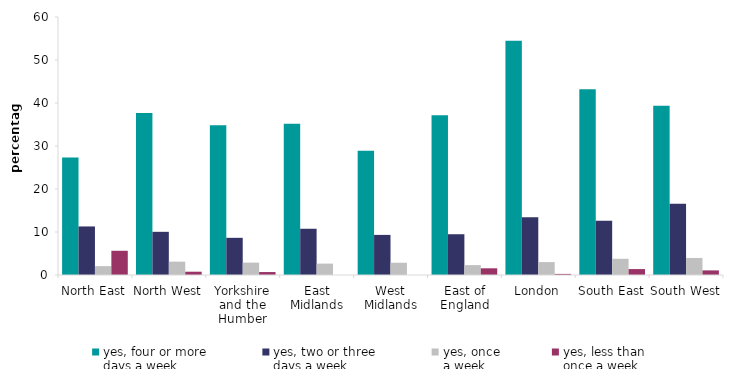
| Category | yes, four or more 
days a week | yes, two or three 
days a week | yes, once
a week | yes, less than 
once a week |
|---|---|---|---|---|
| North East | 27.315 | 11.292 | 2.064 | 5.634 |
| North West | 37.65 | 10.042 | 3.104 | 0.764 |
| Yorkshire and the Humber | 34.85 | 8.644 | 2.877 | 0.687 |
| East Midlands | 35.167 | 10.752 | 2.648 | 0 |
| West Midlands | 28.903 | 9.326 | 2.849 | 0 |
| East of England | 37.129 | 9.48 | 2.3 | 1.557 |
| London | 54.474 | 13.412 | 3.005 | 0.256 |
| South East | 43.172 | 12.59 | 3.77 | 1.377 |
| South West | 39.386 | 16.555 | 3.961 | 1.073 |